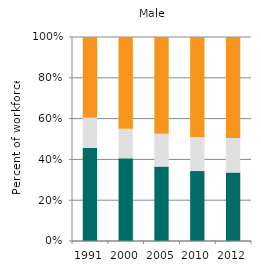
| Category | Agriculture | Industry | Services |
|---|---|---|---|
| 1991.0 | 45.687 | 14.714 | 39.599 |
| 2000.0 | 40.508 | 14.469 | 45.023 |
| 2005.0 | 36.472 | 16.094 | 47.433 |
| 2010.0 | 34.271 | 16.753 | 48.975 |
| 2012.0 | 33.553 | 16.968 | 49.479 |